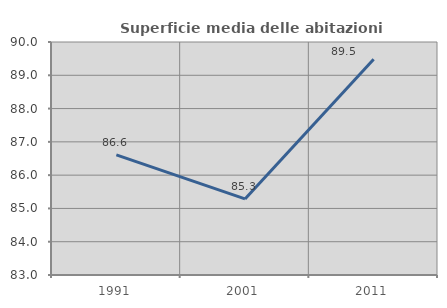
| Category | Superficie media delle abitazioni occupate |
|---|---|
| 1991.0 | 86.607 |
| 2001.0 | 85.285 |
| 2011.0 | 89.485 |